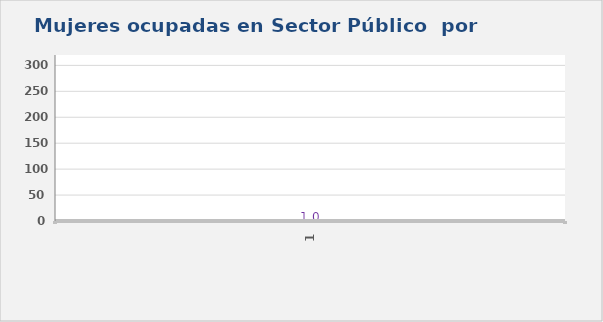
| Category | Series 7 |
|---|---|
| 0 | 1 |